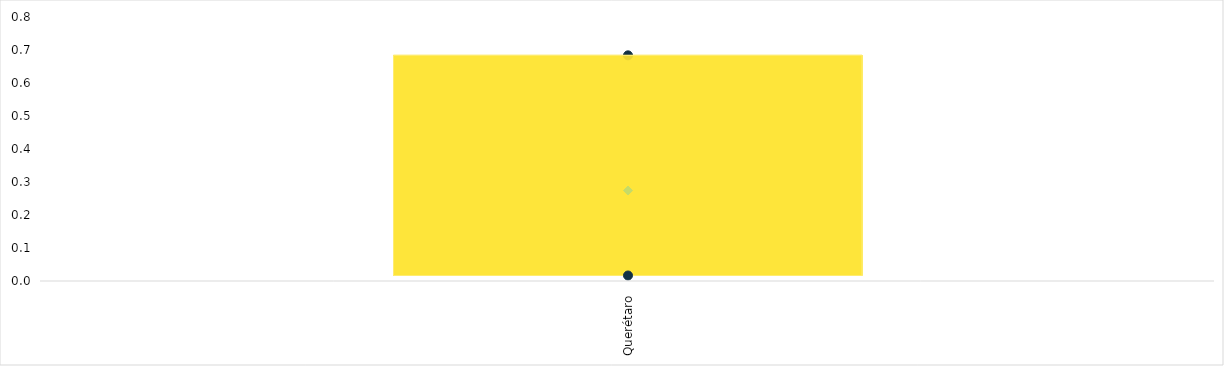
| Category | Máx. de GA | Promedio de GA2 | Mín. de GA3 |
|---|---|---|---|
| Querétaro | 0.684 | 0.274 | 0.017 |